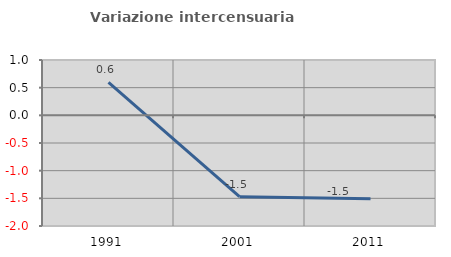
| Category | Variazione intercensuaria annua |
|---|---|
| 1991.0 | 0.594 |
| 2001.0 | -1.471 |
| 2011.0 | -1.506 |